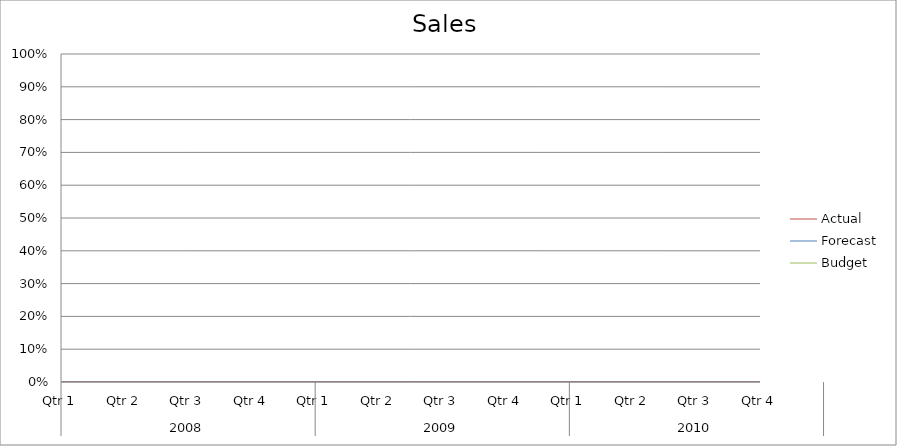
| Category | Budget | Forecast | Actual |
|---|---|---|---|
| 0 | 1850 | 1860 | 3460 |
| 1 | 2830 | 3020 | 1230 |
| 2 | 3130 | 1730 | 3100 |
| 3 | 1260 | 1220 | 3490 |
| 4 | 2870 | 1970 | 2830 |
| 5 | 2690 | 2050 | 2580 |
| 6 | 2070 | 1550 | 2020 |
| 7 | 1350 | 1640 | 3110 |
| 8 | 2290 | 2810 | 3170 |
| 9 | 3110 | 2320 | 2740 |
| 10 | 2290 | 830 | 690 |
| 11 | 970 | 560 | 1600 |